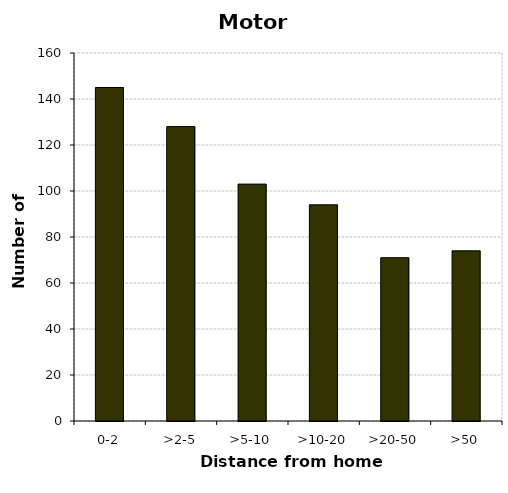
| Category | Motorcycles |
|---|---|
| 0-2 | 145 |
| >2-5 | 128 |
| >5-10 | 103 |
| >10-20 | 94 |
| >20-50 | 71 |
| >50 | 74 |